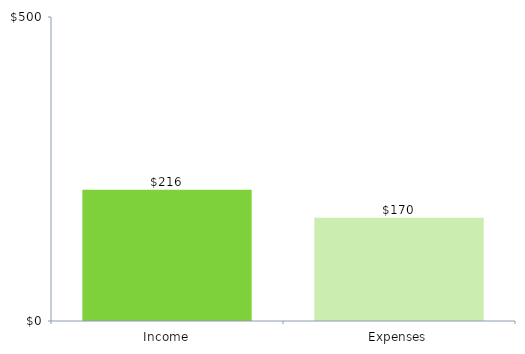
| Category | ChartData |
|---|---|
| 0 | 216 |
| 1 | 170 |